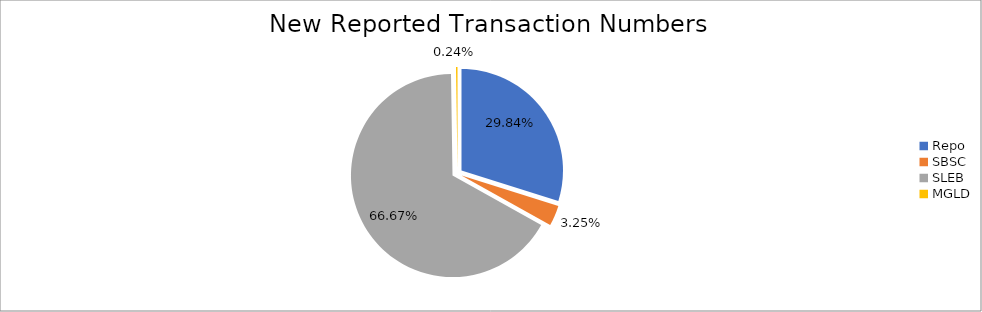
| Category | Series 0 |
|---|---|
| Repo | 400368 |
| SBSC | 43604 |
| SLEB | 894540 |
| MGLD | 3164 |